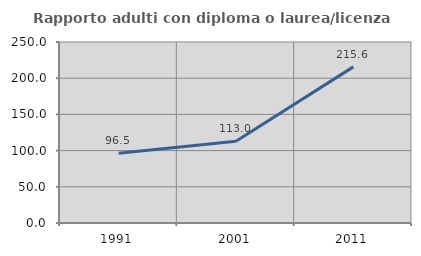
| Category | Rapporto adulti con diploma o laurea/licenza media  |
|---|---|
| 1991.0 | 96.491 |
| 2001.0 | 113.043 |
| 2011.0 | 215.625 |